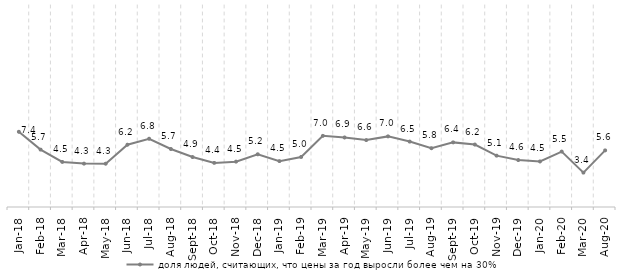
| Category | доля людей, считающих, что цены за год выросли более чем на 30% |
|---|---|
| 2018-01-01 | 7.445 |
| 2018-02-01 | 5.682 |
| 2018-03-01 | 4.463 |
| 2018-04-01 | 4.296 |
| 2018-05-01 | 4.287 |
| 2018-06-01 | 6.164 |
| 2018-07-01 | 6.758 |
| 2018-08-01 | 5.744 |
| 2018-09-01 | 4.946 |
| 2018-10-01 | 4.368 |
| 2018-11-01 | 4.491 |
| 2018-12-01 | 5.219 |
| 2019-01-01 | 4.543 |
| 2019-02-01 | 4.953 |
| 2019-03-01 | 7.044 |
| 2019-04-01 | 6.883 |
| 2019-05-01 | 6.627 |
| 2019-06-01 | 6.991 |
| 2019-07-01 | 6.476 |
| 2019-08-01 | 5.822 |
| 2019-09-01 | 6.397 |
| 2019-10-01 | 6.183 |
| 2019-11-01 | 5.085 |
| 2019-12-01 | 4.649 |
| 2020-01-01 | 4.51 |
| 2020-02-01 | 5.488 |
| 2020-03-01 | 3.403 |
| 2020-08-01 | 5.606 |